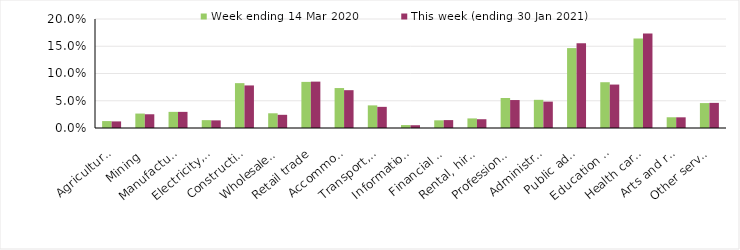
| Category | Week ending 14 Mar 2020 | This week (ending 30 Jan 2021) |
|---|---|---|
| Agriculture, forestry and fishing | 0.013 | 0.012 |
| Mining | 0.026 | 0.025 |
| Manufacturing | 0.03 | 0.03 |
| Electricity, gas, water and waste services | 0.014 | 0.014 |
| Construction | 0.082 | 0.078 |
| Wholesale trade | 0.027 | 0.024 |
| Retail trade | 0.085 | 0.085 |
| Accommodation and food services | 0.073 | 0.069 |
| Transport, postal and warehousing | 0.042 | 0.039 |
| Information media and telecommunications | 0.005 | 0.005 |
| Financial and insurance services | 0.014 | 0.014 |
| Rental, hiring and real estate services | 0.018 | 0.016 |
| Professional, scientific and technical services | 0.055 | 0.051 |
| Administrative and support services | 0.052 | 0.048 |
| Public administration and safety | 0.147 | 0.156 |
| Education and training | 0.084 | 0.08 |
| Health care and social assistance | 0.164 | 0.173 |
| Arts and recreation services | 0.02 | 0.02 |
| Other services | 0.046 | 0.046 |